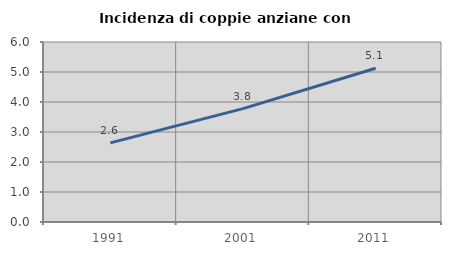
| Category | Incidenza di coppie anziane con figli |
|---|---|
| 1991.0 | 2.638 |
| 2001.0 | 3.778 |
| 2011.0 | 5.126 |